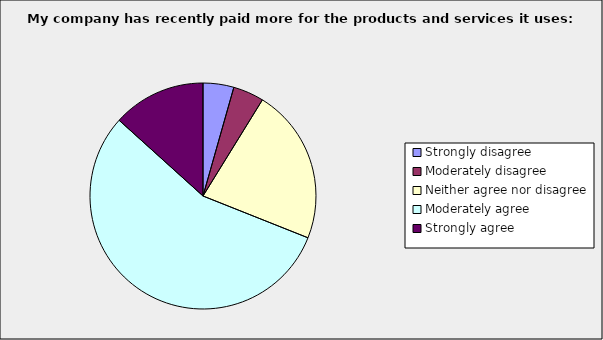
| Category | Series 0 |
|---|---|
| Strongly disagree | 0.044 |
| Moderately disagree | 0.044 |
| Neither agree nor disagree | 0.222 |
| Moderately agree | 0.556 |
| Strongly agree | 0.133 |